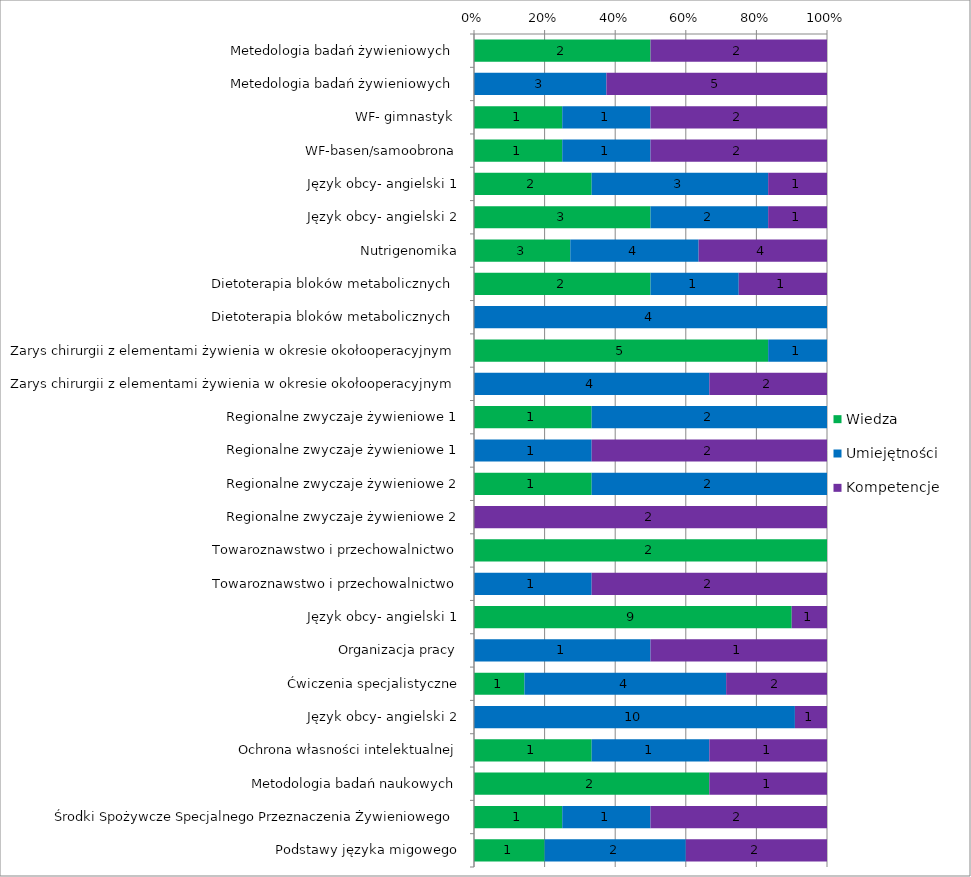
| Category | Wiedza | Umiejętności | Kompetencje |
|---|---|---|---|
| Metedologia badań żywieniowych  | 2 | 0 | 2 |
| Metedologia badań żywieniowych  | 0 | 3 | 5 |
| WF- gimnastyk  | 1 | 1 | 2 |
| WF-basen/samoobrona | 1 | 1 | 2 |
| Język obcy- angielski 1 | 2 | 3 | 1 |
| Język obcy- angielski 2 | 3 | 2 | 1 |
| Nutrigenomika | 3 | 4 | 4 |
| Dietoterapia bloków metabolicznych  | 2 | 1 | 1 |
| Dietoterapia bloków metabolicznych  | 0 | 4 | 0 |
| Zarys chirurgii z elementami żywienia w okresie okołooperacyjnym | 5 | 1 | 0 |
| Zarys chirurgii z elementami żywienia w okresie okołooperacyjnym | 0 | 4 | 2 |
| Regionalne zwyczaje żywieniowe 1 | 1 | 2 | 0 |
| Regionalne zwyczaje żywieniowe 1 | 0 | 1 | 2 |
| Regionalne zwyczaje żywieniowe 2 | 1 | 2 | 0 |
| Regionalne zwyczaje żywieniowe 2 | 0 | 0 | 2 |
| Towaroznawstwo i przechowalnictwo | 2 | 0 | 0 |
| Towaroznawstwo i przechowalnictwo | 0 | 1 | 2 |
| Język obcy- angielski 1 | 9 | 0 | 1 |
| Organizacja pracy | 0 | 1 | 1 |
| Ćwiczenia specjalistyczne | 1 | 4 | 2 |
| Język obcy- angielski 2 | 0 | 10 | 1 |
| Ochrona własności intelektualnej | 1 | 1 | 1 |
| Metodologia badań naukowych | 2 | 0 | 1 |
| Środki Spożywcze Specjalnego Przeznaczenia Żywieniowego | 1 | 1 | 2 |
| Podstawy języka migowego | 1 | 2 | 2 |